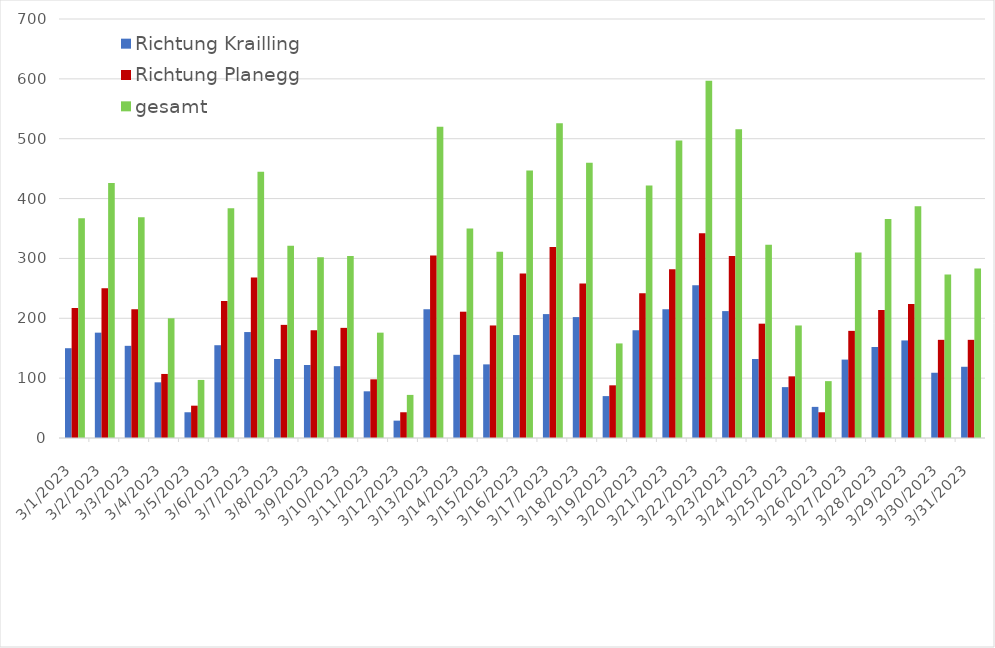
| Category | Richtung Krailling | Richtung Planegg | gesamt |
|---|---|---|---|
| 3/1/23 | 150 | 217 | 367 |
| 3/2/23 | 176 | 250 | 426 |
| 3/3/23 | 154 | 215 | 369 |
| 3/4/23 | 93 | 107 | 200 |
| 3/5/23 | 43 | 54 | 97 |
| 3/6/23 | 155 | 229 | 384 |
| 3/7/23 | 177 | 268 | 445 |
| 3/8/23 | 132 | 189 | 321 |
| 3/9/23 | 122 | 180 | 302 |
| 3/10/23 | 120 | 184 | 304 |
| 3/11/23 | 78 | 98 | 176 |
| 3/12/23 | 29 | 43 | 72 |
| 3/13/23 | 215 | 305 | 520 |
| 3/14/23 | 139 | 211 | 350 |
| 3/15/23 | 123 | 188 | 311 |
| 3/16/23 | 172 | 275 | 447 |
| 3/17/23 | 207 | 319 | 526 |
| 3/18/23 | 202 | 258 | 460 |
| 3/19/23 | 70 | 88 | 158 |
| 3/20/23 | 180 | 242 | 422 |
| 3/21/23 | 215 | 282 | 497 |
| 3/22/23 | 255 | 342 | 597 |
| 3/23/23 | 212 | 304 | 516 |
| 3/24/23 | 132 | 191 | 323 |
| 3/25/23 | 85 | 103 | 188 |
| 3/26/23 | 52 | 43 | 95 |
| 3/27/23 | 131 | 179 | 310 |
| 3/28/23 | 152 | 214 | 366 |
| 3/29/23 | 163 | 224 | 387 |
| 3/30/23 | 109 | 164 | 273 |
| 3/31/23 | 119 | 164 | 283 |